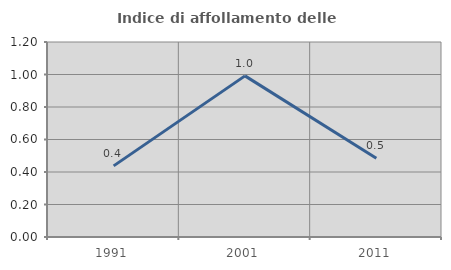
| Category | Indice di affollamento delle abitazioni  |
|---|---|
| 1991.0 | 0.438 |
| 2001.0 | 0.992 |
| 2011.0 | 0.484 |